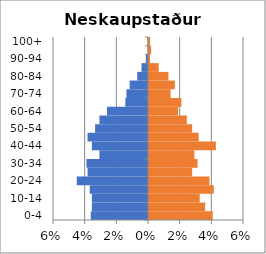
| Category | % Men | % Women |
|---|---|---|
| 0-4 | -0.036 | 0.04 |
| 5-9 | -0.035 | 0.035 |
| 10-14 | -0.035 | 0.032 |
| 15-19 | -0.037 | 0.041 |
| 20-24 | -0.045 | 0.038 |
| 25-29 | -0.038 | 0.027 |
| 30-34 | -0.039 | 0.031 |
| 35-39 | -0.031 | 0.029 |
| 40-44 | -0.035 | 0.042 |
| 45-49 | -0.038 | 0.031 |
| 50-54 | -0.033 | 0.027 |
| 55-59 | -0.031 | 0.024 |
| 60-64 | -0.026 | 0.018 |
| 65-69 | -0.014 | 0.02 |
| 70-74 | -0.014 | 0.014 |
| 75-79 | -0.012 | 0.016 |
| 80-84 | -0.007 | 0.012 |
| 85-89 | -0.004 | 0.006 |
| 90-94 | -0.001 | 0.001 |
| 95-99 | 0 | 0.001 |
| 100+ | 0 | 0.001 |